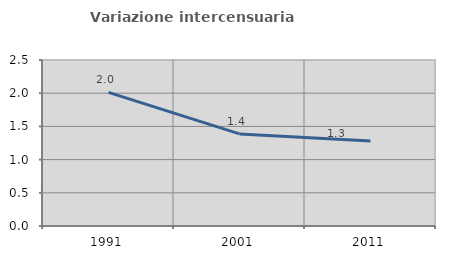
| Category | Variazione intercensuaria annua |
|---|---|
| 1991.0 | 2.011 |
| 2001.0 | 1.387 |
| 2011.0 | 1.28 |